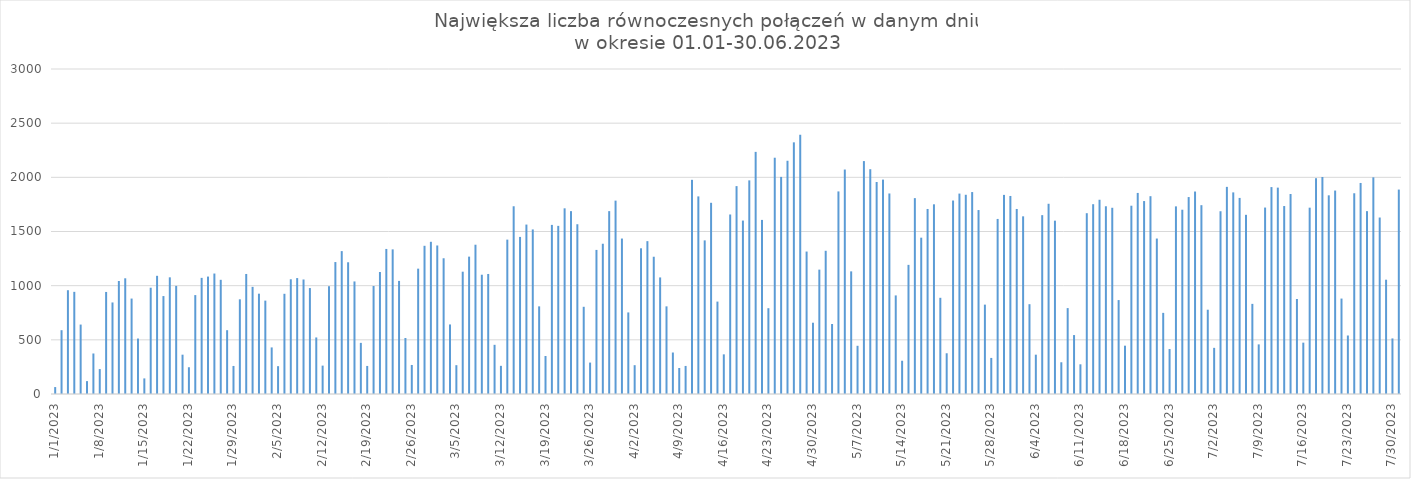
| Category | Max liczba połączeń |
|---|---|
| 1/1/23 | 64 |
| 1/2/23 | 589 |
| 1/3/23 | 958 |
| 1/4/23 | 943 |
| 1/5/23 | 641 |
| 1/6/23 | 119 |
| 1/7/23 | 374 |
| 1/8/23 | 230 |
| 1/9/23 | 942 |
| 1/10/23 | 845 |
| 1/11/23 | 1043 |
| 1/12/23 | 1068 |
| 1/13/23 | 881 |
| 1/14/23 | 512 |
| 1/15/23 | 144 |
| 1/16/23 | 981 |
| 1/17/23 | 1091 |
| 1/18/23 | 904 |
| 1/19/23 | 1077 |
| 1/20/23 | 998 |
| 1/21/23 | 363 |
| 1/22/23 | 247 |
| 1/23/23 | 913 |
| 1/24/23 | 1072 |
| 1/25/23 | 1084 |
| 1/26/23 | 1112 |
| 1/27/23 | 1054 |
| 1/28/23 | 589 |
| 1/29/23 | 259 |
| 1/30/23 | 874 |
| 1/31/23 | 1108 |
| 2/1/23 | 989 |
| 2/2/23 | 926 |
| 2/3/23 | 862 |
| 2/4/23 | 430 |
| 2/5/23 | 257 |
| 2/6/23 | 925 |
| 2/7/23 | 1059 |
| 2/8/23 | 1070 |
| 2/9/23 | 1057 |
| 2/10/23 | 978 |
| 2/11/23 | 522 |
| 2/12/23 | 262 |
| 2/13/23 | 995 |
| 2/14/23 | 1218 |
| 2/15/23 | 1319 |
| 2/16/23 | 1216 |
| 2/17/23 | 1039 |
| 2/18/23 | 472 |
| 2/19/23 | 259 |
| 2/20/23 | 997 |
| 2/21/23 | 1126 |
| 2/22/23 | 1339 |
| 2/23/23 | 1335 |
| 2/24/23 | 1044 |
| 2/25/23 | 517 |
| 2/26/23 | 268 |
| 2/27/23 | 1157 |
| 2/28/23 | 1368 |
| 3/1/23 | 1405 |
| 3/2/23 | 1371 |
| 3/3/23 | 1253 |
| 3/4/23 | 642 |
| 3/5/23 | 266 |
| 3/6/23 | 1129 |
| 3/7/23 | 1268 |
| 3/8/23 | 1378 |
| 3/9/23 | 1101 |
| 3/10/23 | 1108 |
| 3/11/23 | 454 |
| 3/12/23 | 260 |
| 3/13/23 | 1425 |
| 3/14/23 | 1733 |
| 3/15/23 | 1450 |
| 3/16/23 | 1564 |
| 3/17/23 | 1519 |
| 3/18/23 | 809 |
| 3/19/23 | 351 |
| 3/20/23 | 1561 |
| 3/21/23 | 1552 |
| 3/22/23 | 1714 |
| 3/23/23 | 1688 |
| 3/24/23 | 1567 |
| 3/25/23 | 805 |
| 3/26/23 | 290 |
| 3/27/23 | 1330 |
| 3/28/23 | 1387 |
| 3/29/23 | 1688 |
| 3/30/23 | 1785 |
| 3/31/23 | 1435 |
| 4/1/23 | 753 |
| 4/2/23 | 266 |
| 4/3/23 | 1345 |
| 4/4/23 | 1411 |
| 4/5/23 | 1267 |
| 4/6/23 | 1076 |
| 4/7/23 | 809 |
| 4/8/23 | 383 |
| 4/9/23 | 240 |
| 4/10/23 | 259 |
| 4/11/23 | 1977 |
| 4/12/23 | 1824 |
| 4/13/23 | 1418 |
| 4/14/23 | 1765 |
| 4/15/23 | 853 |
| 4/16/23 | 366 |
| 4/17/23 | 1657 |
| 4/18/23 | 1919 |
| 4/19/23 | 1601 |
| 4/20/23 | 1972 |
| 4/21/23 | 2235 |
| 4/22/23 | 1607 |
| 4/23/23 | 792 |
| 4/24/23 | 2181 |
| 4/25/23 | 2004 |
| 4/26/23 | 2153 |
| 4/27/23 | 2323 |
| 4/28/23 | 2394 |
| 4/29/23 | 1315 |
| 4/30/23 | 658 |
| 5/1/23 | 1148 |
| 5/2/23 | 1322 |
| 5/3/23 | 646 |
| 5/4/23 | 1870 |
| 5/5/23 | 2072 |
| 5/6/23 | 1132 |
| 5/7/23 | 445 |
| 5/8/23 | 2150 |
| 5/9/23 | 2075 |
| 5/10/23 | 1957 |
| 5/11/23 | 1979 |
| 5/12/23 | 1851 |
| 5/13/23 | 910 |
| 5/14/23 | 307 |
| 5/15/23 | 1192 |
| 5/16/23 | 1808 |
| 5/17/23 | 1443 |
| 5/18/23 | 1708 |
| 5/19/23 | 1751 |
| 5/20/23 | 888 |
| 5/21/23 | 376 |
| 5/22/23 | 1786 |
| 5/23/23 | 1850 |
| 5/24/23 | 1839 |
| 5/25/23 | 1864 |
| 5/26/23 | 1698 |
| 5/27/23 | 825 |
| 5/28/23 | 333 |
| 5/29/23 | 1616 |
| 5/30/23 | 1838 |
| 5/31/23 | 1828 |
| 6/1/23 | 1708 |
| 6/2/23 | 1640 |
| 6/3/23 | 829 |
| 6/4/23 | 363 |
| 6/5/23 | 1651 |
| 6/6/23 | 1756 |
| 6/7/23 | 1600 |
| 6/8/23 | 293 |
| 6/9/23 | 793 |
| 6/10/23 | 544 |
| 6/11/23 | 274 |
| 6/12/23 | 1669 |
| 6/13/23 | 1752 |
| 6/14/23 | 1793 |
| 6/15/23 | 1733 |
| 6/16/23 | 1719 |
| 6/17/23 | 867 |
| 6/18/23 | 446 |
| 6/19/23 | 1738 |
| 6/20/23 | 1856 |
| 6/21/23 | 1781 |
| 6/22/23 | 1826 |
| 6/23/23 | 1435 |
| 6/24/23 | 749 |
| 6/25/23 | 415 |
| 6/26/23 | 1732 |
| 6/27/23 | 1701 |
| 6/28/23 | 1818 |
| 6/29/23 | 1869 |
| 6/30/23 | 1743 |
| 7/1/23 | 778 |
| 7/2/23 | 426 |
| 7/3/23 | 1687 |
| 7/4/23 | 1912 |
| 7/5/23 | 1861 |
| 7/6/23 | 1810 |
| 7/7/23 | 1654 |
| 7/8/23 | 832 |
| 7/9/23 | 458 |
| 7/10/23 | 1721 |
| 7/11/23 | 1910 |
| 7/12/23 | 1905 |
| 7/13/23 | 1735 |
| 7/14/23 | 1846 |
| 7/15/23 | 877 |
| 7/16/23 | 474 |
| 7/17/23 | 1720 |
| 7/18/23 | 1992 |
| 7/19/23 | 2003 |
| 7/20/23 | 1834 |
| 7/21/23 | 1878 |
| 7/22/23 | 881 |
| 7/23/23 | 540 |
| 7/24/23 | 1853 |
| 7/25/23 | 1948 |
| 7/26/23 | 1688 |
| 7/27/23 | 2000 |
| 7/28/23 | 1629 |
| 7/29/23 | 1055 |
| 7/30/23 | 513 |
| 7/31/23 | 1887 |